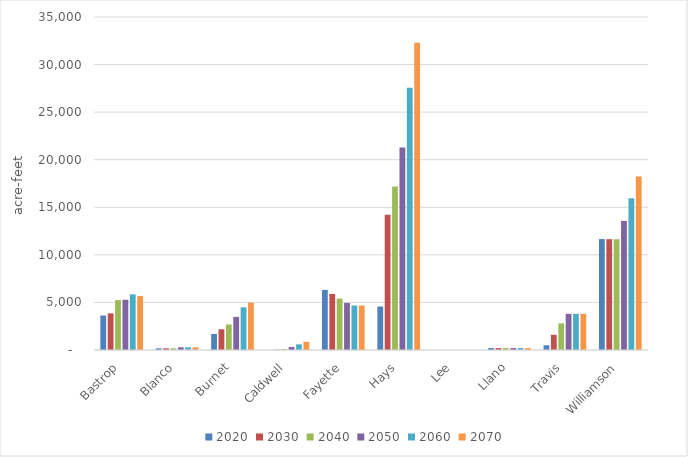
| Category | 2020 | 2030 | 2040 | 2050 | 2060 | 2070 |
|---|---|---|---|---|---|---|
| Bastrop | 3625 | 3853 | 5246 | 5277 | 5850 | 5665 |
| Blanco | 175 | 175 | 175 | 285 | 285 | 285 |
| Burnet | 1680 | 2180 | 2680 | 3480 | 4480 | 4980 |
| Caldwell | 0 | 31 | 66 | 316 | 590 | 864 |
| Fayette | 6316 | 5892 | 5404 | 4948 | 4674 | 4674 |
| Hays | 4571 | 14222 | 17187 | 21287 | 27571 | 32293 |
| Lee | 0 | 0 | 0 | 0 | 0 | 0 |
| Llano | 200 | 200 | 200 | 200 | 200 | 200 |
| Travis | 500 | 1600 | 2800 | 3800 | 3800 | 3800 |
| Williamson | 11659 | 11649 | 11641 | 13560 | 15939 | 18231 |